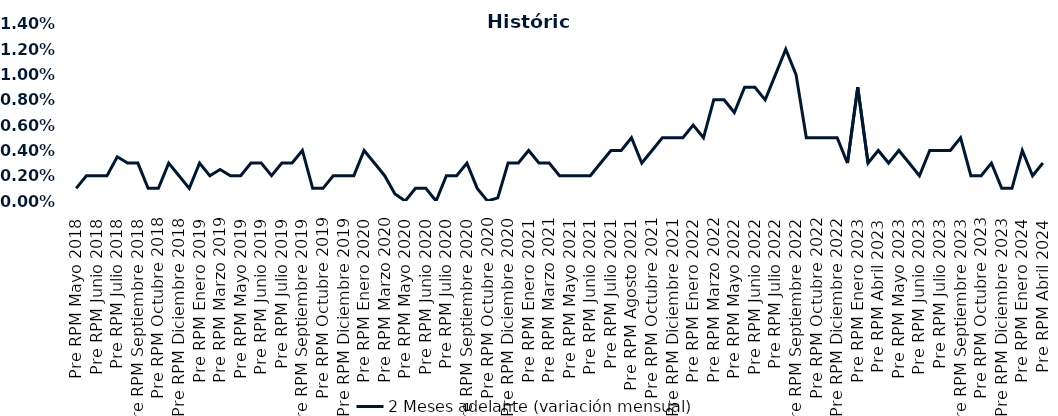
| Category | 2 Meses adelante (variación mensual) |
|---|---|
| Pre RPM Mayo 2018 | 0.001 |
| Post RPM Mayo 2018 | 0.002 |
| Pre RPM Junio 2018 | 0.002 |
| Post RPM Junio 2018 | 0.002 |
| Pre RPM Julio 2018 | 0.004 |
| Post RPM Julio 2018 | 0.003 |
| Pre RPM Septiembre 2018 | 0.003 |
| Post RPM Septiembre 2018 | 0.001 |
| Pre RPM Octubre 2018 | 0.001 |
| Post RPM Octubre 2018 | 0.003 |
| Pre RPM Diciembre 2018 | 0.002 |
| Post RPM Diciembre 2018 | 0.001 |
| Pre RPM Enero 2019 | 0.003 |
| Post RPM Enero 2019 | 0.002 |
| Pre RPM Marzo 2019 | 0.002 |
| Post RPM Marzo 2019 | 0.002 |
| Pre RPM Mayo 2019 | 0.002 |
| Post RPM Mayo 2019 | 0.003 |
| Pre RPM Junio 2019 | 0.003 |
| Post RPM Junio 2019 | 0.002 |
| Pre RPM Julio 2019 | 0.003 |
| Post RPM Julio 2019 | 0.003 |
| Pre RPM Septiembre 2019 | 0.004 |
| Post RPM Septiembre 2019 | 0.001 |
| Pre RPM Octubre 2019 | 0.001 |
| Post RPM Octubre 2019 | 0.002 |
| Pre RPM Diciembre 2019 | 0.002 |
| Post RPM Diciembre 2019 | 0.002 |
| Pre RPM Enero 2020 | 0.004 |
| Post RPM Enero 2020 | 0.003 |
| Pre RPM Marzo 2020 | 0.002 |
| Post RPM Marzo 2020 | 0.001 |
| Pre RPM Mayo 2020 | 0 |
| Post RPM Mayo 2020 | 0.001 |
| Pre RPM Junio 2020 | 0.001 |
| Post RPM Junio 2020 | 0 |
| Pre RPM Julio 2020 | 0.002 |
| Post RPM Julio 2020 | 0.002 |
| Pre RPM Septiembre 2020 | 0.003 |
| Post RPM Septiembre 2020 | 0.001 |
| Pre RPM Octubre 2020 | 0 |
| Post RPM Octubre 2020 | 0 |
| Pre RPM Diciembre 2020 | 0.003 |
| Post RPM Diciembre 2020 | 0.003 |
| Pre RPM Enero 2021 | 0.004 |
| Post RPM Enero 2021 | 0.003 |
| Pre RPM Marzo 2021 | 0.003 |
| Post RPM Marzo 2021 | 0.002 |
| Pre RPM Mayo 2021 | 0.002 |
| Post RPM Mayo 2021 | 0.002 |
| Pre RPM Junio 2021 | 0.002 |
| Post RPM Junio 2021 | 0.003 |
| Pre RPM Julio 2021 | 0.004 |
| Post RPM Julio 2021 | 0.004 |
| Pre RPM Agosto 2021 | 0.005 |
| Post RPM Agosto 2021 | 0.003 |
| Pre RPM Octubre 2021 | 0.004 |
| Post RPM Octubre 2021 | 0.005 |
| Pre RPM Diciembre 2021 | 0.005 |
| Post RPM Diciembre 2021 | 0.005 |
| Pre RPM Enero 2022 | 0.006 |
| Post RPM Enero 2022 | 0.005 |
| Pre RPM Marzo 2022 | 0.008 |
| Post RPM Marzo 2022 | 0.008 |
| Pre RPM Mayo 2022 | 0.007 |
| Post RPM Mayo 2022 | 0.009 |
| Pre RPM Junio 2022 | 0.009 |
| Post RPM Junio 2022 | 0.008 |
| Pre RPM Julio 2022 | 0.01 |
| Post RPM Julio 2022 | 0.012 |
| Pre RPM Septiembre 2022 | 0.01 |
| Post RPM Septiembre 2022 | 0.005 |
| Pre RPM Octubre 2022 | 0.005 |
| Post RPM Octubre 2022 | 0.005 |
| Pre RPM Diciembre 2022 | 0.005 |
| Post RPM Diciembre 2022 | 0.003 |
| Pre RPM Enero 2023 | 0.009 |
| Post RPM Enero 2023 | 0.003 |
| Pre RPM Abril 2023 | 0.004 |
| Post RPM Abril 2023 | 0.003 |
| Pre RPM Mayo 2023 | 0.004 |
| Post RPM Mayo 2023 | 0.003 |
| Pre RPM Junio 2023 | 0.002 |
| Post RPM Junio 2023 | 0.004 |
| Pre RPM Julio 2023 | 0.004 |
| Post RPM Julio 2023 | 0.004 |
| Pre RPM Septiembre 2023 | 0.005 |
| Post RPM Septiembre 2023 | 0.002 |
| Pre RPM Octubre 2023 | 0.002 |
| Post RPM Octubre 2023 | 0.003 |
| Pre RPM Diciembre 2023 | 0.001 |
| Post RPM Diciembre 2023 | 0.001 |
| Pre RPM Enero 2024 | 0.004 |
| Post RPM Enero 2024 | 0.002 |
| Pre RPM Abril 2024 | 0.003 |